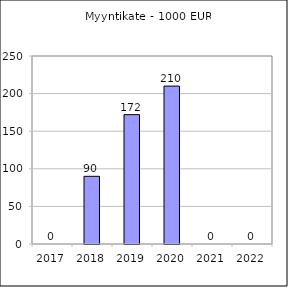
| Category | Myyntikate (tuotot-muuttuvat kulut) |
|---|---|
| 2017.0 | 0 |
| 2018.0 | 90000 |
| 2019.0 | 172000 |
| 2020.0 | 210000 |
| 2021.0 | 0 |
| 2022.0 | 0 |